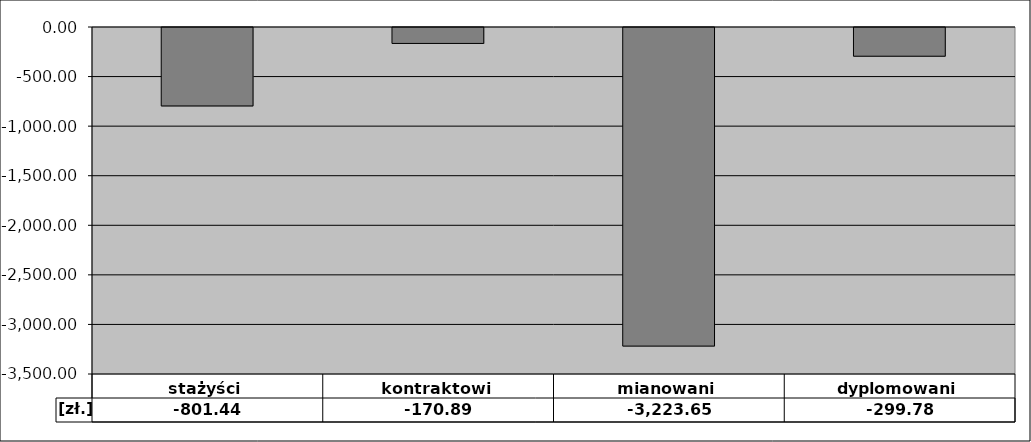
| Category | [zł.] |
|---|---|
| stażyści | -801.436 |
| kontraktowi | -170.887 |
| mianowani | -3223.651 |
| dyplomowani | -299.784 |